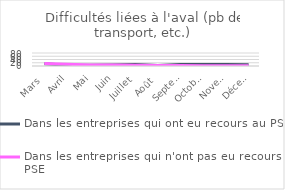
| Category | Dans les entreprises qui ont eu recours au PSE  | Dans les entreprises qui n'ont pas eu recours au PSE  |
|---|---|---|
| Mars | 13.448 | 14.841 |
| Avril | 4.731 | 10.306 |
| Mai | 5.221 | 6.35 |
| Juin | 5.73 | 6.373 |
| Juillet | 8.461 | 4.131 |
| Août | 2.329 | 3.185 |
| Septembre | 9.448 | 2.574 |
| Octobre | 9.099 | 2.234 |
| Novembre | 8.919 | 2.253 |
| Décembre | 8.33 | 2.087 |